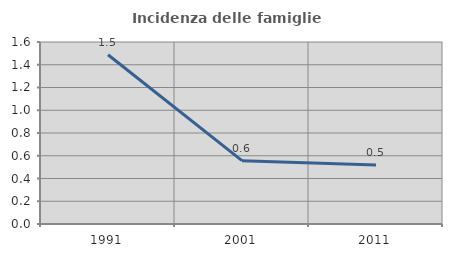
| Category | Incidenza delle famiglie numerose |
|---|---|
| 1991.0 | 1.488 |
| 2001.0 | 0.557 |
| 2011.0 | 0.518 |